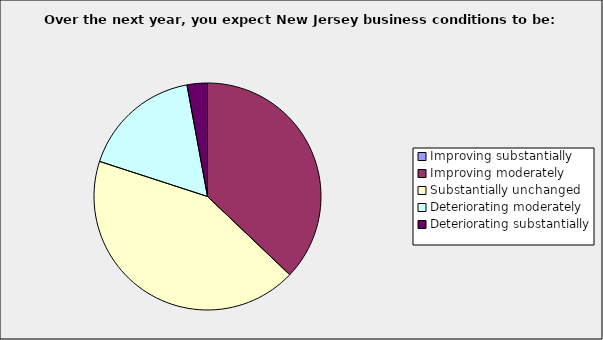
| Category | Series 0 |
|---|---|
| Improving substantially | 0 |
| Improving moderately | 0.371 |
| Substantially unchanged | 0.429 |
| Deteriorating moderately | 0.171 |
| Deteriorating substantially | 0.029 |